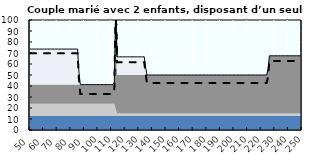
| Category | Coin fiscal marginal (somme des composantes) | Taux d’imposition marginal net |
|---|---|---|
| 50.0 | 73.575 | 69.733 |
| 51.0 | 73.575 | 69.733 |
| 52.0 | 73.575 | 69.733 |
| 53.0 | 73.575 | 69.733 |
| 54.0 | 73.575 | 69.733 |
| 55.0 | 73.575 | 69.733 |
| 56.0 | 73.575 | 69.733 |
| 57.0 | 73.575 | 69.733 |
| 58.0 | 73.575 | 69.733 |
| 59.0 | 73.575 | 69.733 |
| 60.0 | 73.575 | 69.733 |
| 61.0 | 73.575 | 69.733 |
| 62.0 | 73.575 | 69.733 |
| 63.0 | 73.575 | 69.733 |
| 64.0 | 73.575 | 69.733 |
| 65.0 | 73.575 | 69.733 |
| 66.0 | 73.575 | 69.733 |
| 67.0 | 73.575 | 69.733 |
| 68.0 | 73.575 | 69.733 |
| 69.0 | 73.575 | 69.733 |
| 70.0 | 73.575 | 69.733 |
| 71.0 | 73.575 | 69.733 |
| 72.0 | 73.575 | 69.733 |
| 73.0 | 73.575 | 69.733 |
| 74.0 | 73.575 | 69.733 |
| 75.0 | 73.575 | 69.733 |
| 76.0 | 73.575 | 69.733 |
| 77.0 | 73.575 | 69.733 |
| 78.0 | 73.575 | 69.733 |
| 79.0 | 73.575 | 69.733 |
| 80.0 | 73.575 | 69.733 |
| 81.0 | 73.575 | 69.733 |
| 82.0 | 73.575 | 69.733 |
| 83.0 | 73.575 | 69.733 |
| 84.0 | 73.575 | 69.733 |
| 85.0 | 73.575 | 69.733 |
| 86.0 | 52.315 | 45.381 |
| 87.0 | 41.278 | 32.74 |
| 88.0 | 41.278 | 32.74 |
| 89.0 | 41.278 | 32.74 |
| 90.0 | 41.278 | 32.74 |
| 91.0 | 41.278 | 32.74 |
| 92.0 | 41.278 | 32.74 |
| 93.0 | 41.278 | 32.74 |
| 94.0 | 41.278 | 32.74 |
| 95.0 | 41.278 | 32.74 |
| 96.0 | 41.278 | 32.74 |
| 97.0 | 41.278 | 32.74 |
| 98.0 | 41.278 | 32.74 |
| 99.0 | 41.278 | 32.74 |
| 100.0 | 41.278 | 32.74 |
| 101.0 | 41.278 | 32.74 |
| 102.0 | 41.278 | 32.74 |
| 103.0 | 41.278 | 32.74 |
| 104.0 | 41.278 | 32.74 |
| 105.0 | 41.278 | 32.74 |
| 106.0 | 41.278 | 32.74 |
| 107.0 | 41.278 | 32.74 |
| 108.0 | 41.278 | 32.74 |
| 109.0 | 41.278 | 32.74 |
| 110.0 | 41.278 | 32.74 |
| 111.0 | 41.278 | 32.74 |
| 112.0 | 43.491 | 35.274 |
| 113.0 | 112.024 | 113.772 |
| 114.0 | 66.511 | 61.642 |
| 115.0 | 66.511 | 61.642 |
| 116.0 | 66.511 | 61.642 |
| 117.0 | 66.511 | 61.642 |
| 118.0 | 66.511 | 61.642 |
| 119.0 | 66.511 | 61.642 |
| 120.0 | 66.511 | 61.642 |
| 121.0 | 66.511 | 61.642 |
| 122.0 | 66.511 | 61.642 |
| 123.0 | 66.511 | 61.642 |
| 124.0 | 66.511 | 61.642 |
| 125.0 | 66.511 | 61.642 |
| 126.0 | 66.511 | 61.642 |
| 127.0 | 66.511 | 61.642 |
| 128.0 | 66.511 | 61.642 |
| 129.0 | 66.511 | 61.642 |
| 130.0 | 66.511 | 61.642 |
| 131.0 | 66.511 | 61.642 |
| 132.0 | 66.511 | 61.642 |
| 133.0 | 66.511 | 61.642 |
| 134.0 | 66.511 | 61.642 |
| 135.0 | 57.255 | 51.04 |
| 136.0 | 50.009 | 42.74 |
| 137.0 | 50.009 | 42.74 |
| 138.0 | 50.009 | 42.74 |
| 139.0 | 50.009 | 42.74 |
| 140.0 | 50.009 | 42.74 |
| 141.0 | 50.009 | 42.74 |
| 142.0 | 50.009 | 42.74 |
| 143.0 | 50.009 | 42.74 |
| 144.0 | 50.009 | 42.74 |
| 145.0 | 50.009 | 42.74 |
| 146.0 | 50.009 | 42.74 |
| 147.0 | 50.009 | 42.74 |
| 148.0 | 50.009 | 42.74 |
| 149.0 | 50.009 | 42.74 |
| 150.0 | 50.009 | 42.74 |
| 151.0 | 50.009 | 42.74 |
| 152.0 | 50.009 | 42.74 |
| 153.0 | 50.009 | 42.74 |
| 154.0 | 50.009 | 42.74 |
| 155.0 | 50.009 | 42.74 |
| 156.0 | 50.009 | 42.74 |
| 157.0 | 50.009 | 42.74 |
| 158.0 | 50.009 | 42.74 |
| 159.0 | 50.009 | 42.74 |
| 160.0 | 50.009 | 42.74 |
| 161.0 | 50.009 | 42.74 |
| 162.0 | 50.009 | 42.74 |
| 163.0 | 50.009 | 42.74 |
| 164.0 | 50.009 | 42.74 |
| 165.0 | 50.009 | 42.74 |
| 166.0 | 50.009 | 42.74 |
| 167.0 | 50.009 | 42.74 |
| 168.0 | 50.009 | 42.74 |
| 169.0 | 50.009 | 42.74 |
| 170.0 | 50.009 | 42.74 |
| 171.0 | 50.009 | 42.74 |
| 172.0 | 50.009 | 42.74 |
| 173.0 | 50.009 | 42.74 |
| 174.0 | 50.009 | 42.74 |
| 175.0 | 50.009 | 42.74 |
| 176.0 | 50.009 | 42.74 |
| 177.0 | 50.009 | 42.74 |
| 178.0 | 50.009 | 42.74 |
| 179.0 | 50.009 | 42.74 |
| 180.0 | 50.009 | 42.74 |
| 181.0 | 50.009 | 42.74 |
| 182.0 | 50.009 | 42.74 |
| 183.0 | 50.009 | 42.74 |
| 184.0 | 50.009 | 42.74 |
| 185.0 | 50.009 | 42.74 |
| 186.0 | 50.009 | 42.74 |
| 187.0 | 50.009 | 42.74 |
| 188.0 | 50.009 | 42.74 |
| 189.0 | 50.009 | 42.74 |
| 190.0 | 50.009 | 42.74 |
| 191.0 | 50.009 | 42.74 |
| 192.0 | 50.009 | 42.74 |
| 193.0 | 50.009 | 42.74 |
| 194.0 | 50.009 | 42.74 |
| 195.0 | 50.009 | 42.74 |
| 196.0 | 50.009 | 42.74 |
| 197.0 | 50.009 | 42.74 |
| 198.0 | 50.009 | 42.74 |
| 199.0 | 50.009 | 42.74 |
| 200.0 | 50.009 | 42.74 |
| 201.0 | 50.009 | 42.74 |
| 202.0 | 50.009 | 42.74 |
| 203.0 | 50.009 | 42.74 |
| 204.0 | 50.009 | 42.74 |
| 205.0 | 50.009 | 42.74 |
| 206.0 | 50.009 | 42.74 |
| 207.0 | 50.009 | 42.74 |
| 208.0 | 50.009 | 42.74 |
| 209.0 | 50.009 | 42.74 |
| 210.0 | 50.009 | 42.74 |
| 211.0 | 50.009 | 42.74 |
| 212.0 | 50.009 | 42.74 |
| 213.0 | 50.009 | 42.74 |
| 214.0 | 50.009 | 42.74 |
| 215.0 | 50.009 | 42.74 |
| 216.0 | 50.009 | 42.74 |
| 217.0 | 50.009 | 42.74 |
| 218.0 | 50.009 | 42.74 |
| 219.0 | 50.009 | 42.74 |
| 220.0 | 50.009 | 42.74 |
| 221.0 | 50.009 | 42.74 |
| 222.0 | 50.009 | 42.74 |
| 223.0 | 50.009 | 42.74 |
| 224.0 | 50.009 | 42.74 |
| 225.0 | 54.691 | 48.103 |
| 226.0 | 67.47 | 62.74 |
| 227.0 | 67.47 | 62.74 |
| 228.0 | 67.47 | 62.74 |
| 229.0 | 67.47 | 62.74 |
| 230.0 | 67.47 | 62.74 |
| 231.0 | 67.47 | 62.74 |
| 232.0 | 67.47 | 62.74 |
| 233.0 | 67.47 | 62.74 |
| 234.0 | 67.47 | 62.74 |
| 235.0 | 67.47 | 62.74 |
| 236.0 | 67.47 | 62.74 |
| 237.0 | 67.47 | 62.74 |
| 238.0 | 67.47 | 62.74 |
| 239.0 | 67.47 | 62.74 |
| 240.0 | 67.47 | 62.74 |
| 241.0 | 67.47 | 62.74 |
| 242.0 | 67.47 | 62.74 |
| 243.0 | 67.47 | 62.74 |
| 244.0 | 67.47 | 62.74 |
| 245.0 | 67.47 | 62.74 |
| 246.0 | 67.47 | 62.74 |
| 247.0 | 67.47 | 62.74 |
| 248.0 | 67.47 | 62.74 |
| 249.0 | 67.47 | 62.74 |
| 250.0 | 67.47 | 62.74 |